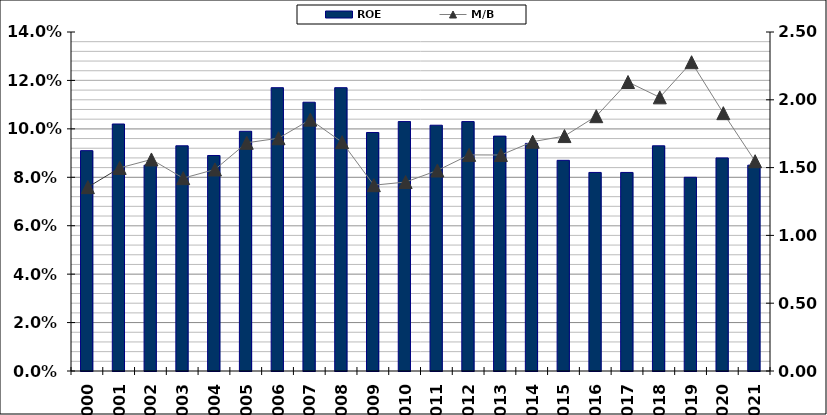
| Category | ROE |
|---|---|
| 2000.0 | 0.091 |
| 2001.0 | 0.102 |
| 2002.0 | 0.085 |
| 2003.0 | 0.093 |
| 2004.0 | 0.089 |
| 2005.0 | 0.099 |
| 2006.0 | 0.117 |
| 2007.0 | 0.111 |
| 2008.0 | 0.117 |
| 2009.0 | 0.098 |
| 2010.0 | 0.103 |
| 2011.0 | 0.102 |
| 2012.0 | 0.103 |
| 2013.0 | 0.097 |
| 2014.0 | 0.094 |
| 2015.0 | 0.087 |
| 2016.0 | 0.082 |
| 2017.0 | 0.082 |
| 2018.0 | 0.093 |
| 2019.0 | 0.08 |
| 2020.0 | 0.088 |
| 2021.0 | 0.085 |